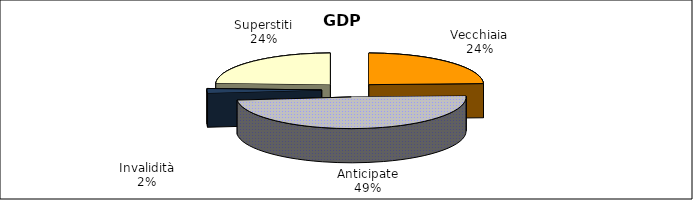
| Category | Series 0 |
|---|---|
| Vecchiaia | 22561 |
| Anticipate | 45166 |
| Invalidità | 2142 |
| Superstiti | 22333 |